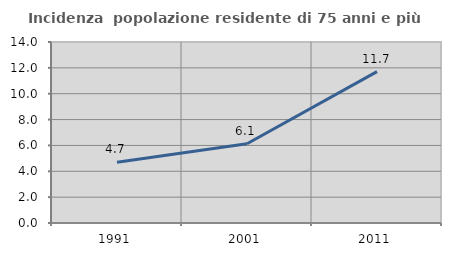
| Category | Incidenza  popolazione residente di 75 anni e più |
|---|---|
| 1991.0 | 4.695 |
| 2001.0 | 6.128 |
| 2011.0 | 11.706 |